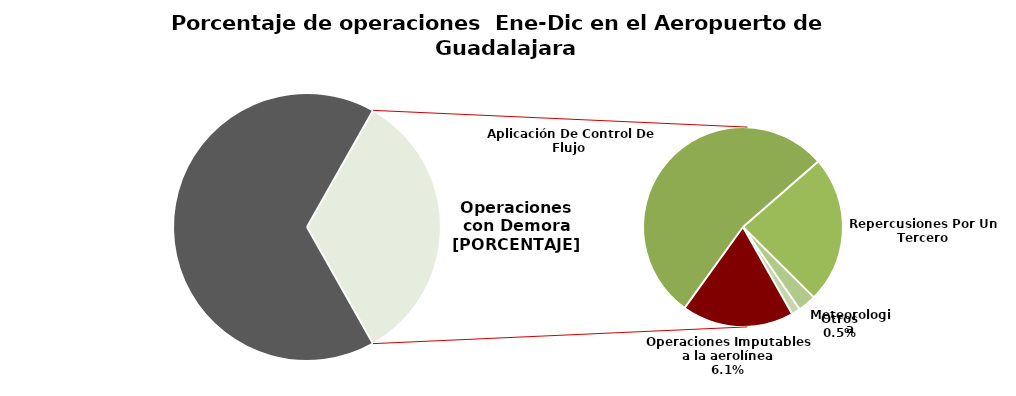
| Category | Series 0 |
|---|---|
| Operaciones a Tiempo | 72454 |
| Operaciones Imputables a la aerolínea | 6655 |
| Aplicación De Control De Flujo  | 19680 |
| Repercusiones Por Un Tercero | 8747 |
| Meteorologia | 1083 |
| Otros | 517 |